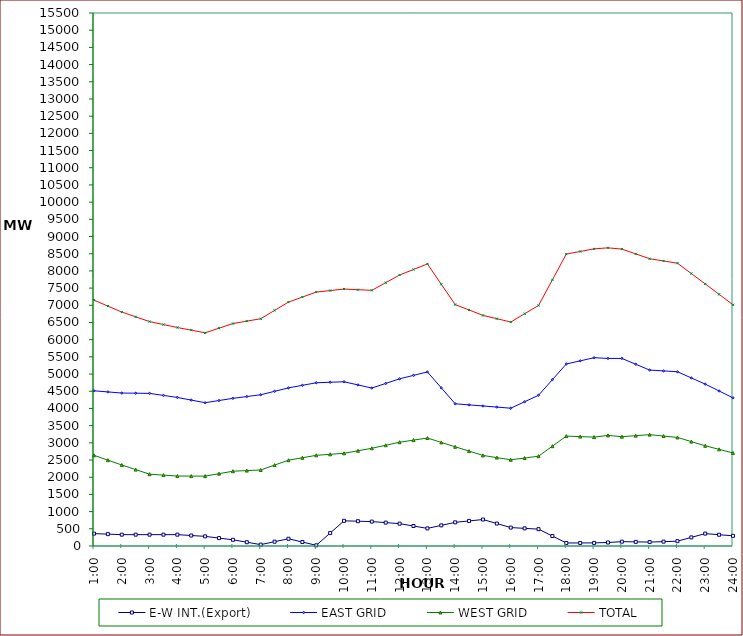
| Category | E-W INT.(Export) | EAST GRID | WEST GRID | TOTAL |
|---|---|---|---|---|
| 1:00 | 360 | 4513 | 2637 | 7150 |
| 1:30 | 345 | 4480.5 | 2496 | 6976.5 |
| 2:00 | 330 | 4448 | 2355 | 6803 |
| 2:30 | 330 | 4443 | 2221.5 | 6664.5 |
| 3:00 | 330 | 4438 | 2088 | 6526 |
| 3:30 | 330 | 4379 | 2061 | 6440 |
| 4:00 | 330 | 4320 | 2034 | 6354 |
| 4:30 | 305 | 4243.5 | 2033 | 6276.5 |
| 5:00 | 280 | 4167 | 2032 | 6199 |
| 5:30 | 230 | 4230.5 | 2103.5 | 6334 |
| 6:00 | 180 | 4294 | 2175 | 6469 |
| 6:30 | 110 | 4346 | 2193 | 6539 |
| 7:00 | 40 | 4398 | 2211 | 6609 |
| 7:30 | 125 | 4498 | 2353 | 6851 |
| 8:00 | 210 | 4598 | 2495 | 7093 |
| 8:30 | 115 | 4672.5 | 2566 | 7238.5 |
| 9:00 | 20 | 4747 | 2637 | 7384 |
| 9:30 | 376 | 4761.5 | 2666.5 | 7428 |
| 10:00 | 732 | 4776 | 2696 | 7472 |
| 10:30 | 721 | 4684.5 | 2769 | 7453.5 |
| 11:00 | 710 | 4593 | 2842 | 7435 |
| 11:30 | 680 | 4727.5 | 2930 | 7657.5 |
| 12:00 | 650 | 4862 | 3018 | 7880 |
| 12:30 | 581 | 4962 | 3079 | 8041 |
| 13:00 | 512 | 5062 | 3140 | 8202 |
| 13:30 | 600 | 4599 | 3012.5 | 7611.5 |
| 14:00 | 688 | 4136 | 2885 | 7021 |
| 14:30 | 729 | 4104 | 2759.5 | 6863.5 |
| 15:00 | 770 | 4072 | 2634 | 6706 |
| 15:30 | 653 | 4039.5 | 2570.5 | 6610 |
| 16:00 | 536 | 4007 | 2507 | 6514 |
| 16:30 | 513 | 4195 | 2559 | 6754 |
| 17:00 | 490 | 4383 | 2611 | 6994 |
| 17:30 | 289 | 4838 | 2903.5 | 7741.5 |
| 18:00 | 88 | 5293 | 3196 | 8489 |
| 18:30 | 89 | 5384 | 3181 | 8565 |
| 19:00 | 90 | 5475 | 3166 | 8641 |
| 19:30 | 102 | 5455 | 3216 | 8671 |
| 20:00 | 126 | 5455 | 3179 | 8634 |
| 20:30 | 120 | 5285.5 | 3208.5 | 8494 |
| 21:00 | 114 | 5116 | 3238 | 8354 |
| 21:30 | 127 | 5091.5 | 3197.5 | 8289 |
| 22:00 | 140 | 5067 | 3157 | 8224 |
| 22:30 | 250 | 4887.5 | 3035.5 | 7923 |
| 23:00 | 360 | 4708 | 2914 | 7622 |
| 23:30 | 328 | 4508 | 2810.5 | 7318.5 |
| 24:00 | 296 | 4308 | 2707 | 7015 |